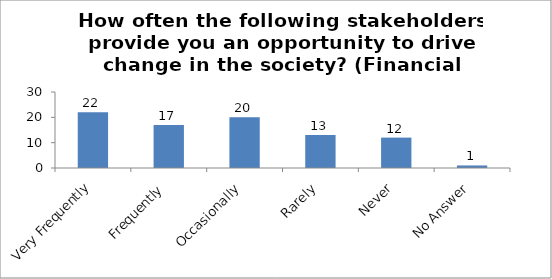
| Category | How often the following stakeholders provide you an opportunity to drive change in the society? (Financial Institutions) |
|---|---|
| Very Frequently | 22 |
| Frequently | 17 |
| Occasionally | 20 |
| Rarely | 13 |
| Never | 12 |
| No Answer | 1 |